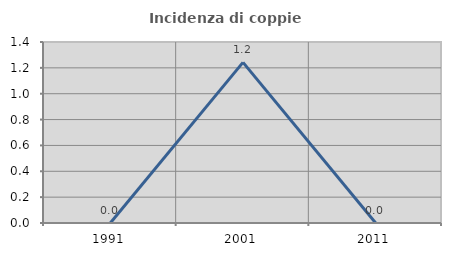
| Category | Incidenza di coppie miste |
|---|---|
| 1991.0 | 0 |
| 2001.0 | 1.242 |
| 2011.0 | 0 |